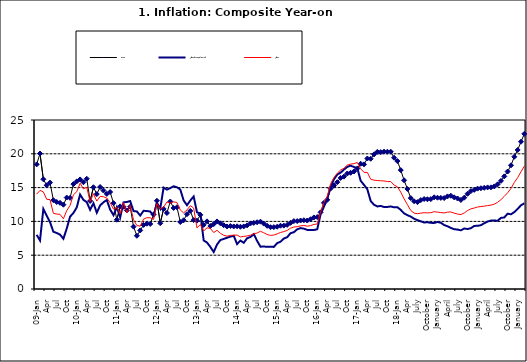
| Category | Food | All Items less Farm Produce | All Items |
|---|---|---|---|
| 09-Jan | 18.436 | 8.013 | 14.034 |
| Feb | 20.041 | 7.178 | 14.584 |
| Mar | 16.233 | 11.842 | 14.366 |
| Apr | 15.342 | 10.85 | 13.268 |
| May | 15.74 | 9.88 | 13.212 |
| June | 13.138 | 8.472 | 11.194 |
| Jul | 12.867 | 8.285 | 11.09 |
| Aug | 12.746 | 8.044 | 11.046 |
| Sep | 12.472 | 7.431 | 10.39 |
| Oct | 13.524 | 8.933 | 11.588 |
| Nov | 13.482 | 10.702 | 12.368 |
| Dec | 15.518 | 11.249 | 13.93 |
| 10-Jan | 15.918 | 12.063 | 14.398 |
| Feb | 16.208 | 13.978 | 15.649 |
| Mar | 15.79 | 13.184 | 14.812 |
| Apr | 16.306 | 12.844 | 15.044 |
| May | 13.023 | 11.711 | 12.915 |
| Jun | 15.053 | 12.686 | 14.099 |
| Jul | 14.043 | 11.287 | 13.002 |
| Aug | 15.09 | 12.366 | 13.702 |
| Sep | 14.57 | 12.83 | 13.65 |
| Oct | 14.065 | 13.168 | 13.45 |
| Nov | 14.351 | 11.746 | 12.766 |
| Dec | 12.701 | 10.917 | 11.815 |
| 11-Jan | 10.255 | 12.118 | 12.08 |
| Feb | 12.221 | 10.569 | 11.1 |
| Mar | 12.169 | 12.815 | 12.779 |
| Apr | 11.629 | 12.882 | 11.291 |
| May | 12.179 | 13.006 | 12.352 |
| Jun | 9.22 | 11.524 | 10.23 |
| Jul | 7.877 | 11.472 | 9.397 |
| Aug | 8.665 | 10.863 | 9.301 |
| Sep | 9.479 | 11.567 | 10.339 |
| Oct | 9.656 | 11.539 | 10.544 |
| Nov | 9.623 | 11.459 | 10.54 |
| Dec | 11.02 | 10.822 | 10.283 |
| 12-Jan | 13.053 | 12.748 | 12.626 |
| 12-Feb | 9.729 | 11.901 | 11.866 |
| 12-Mar | 11.848 | 14.995 | 12.111 |
| Apr | 11.246 | 14.703 | 12.866 |
| May | 12.942 | 14.926 | 12.688 |
| Jun | 11.991 | 15.199 | 12.892 |
| Jul | 12.093 | 15.045 | 12.797 |
| Aug | 9.91 | 14.714 | 11.689 |
| Sep | 10.164 | 13.101 | 11.253 |
| Oct | 11.064 | 12.398 | 11.693 |
| Nov | 11.553 | 13.092 | 12.32 |
| Dec | 10.199 | 13.685 | 11.981 |
| 13-Jan | 10.106 | 11.342 | 9.031 |
| Feb | 10.973 | 11.184 | 9.542 |
| Mar | 9.482 | 7.179 | 8.593 |
| Apr | 10.006 | 6.874 | 9.052 |
| May | 9.321 | 6.227 | 8.964 |
| Jun | 9.606 | 5.472 | 8.353 |
| Jul | 9.994 | 6.58 | 8.682 |
| Aug | 9.723 | 7.245 | 8.231 |
| Sep | 9.437 | 7.41 | 7.952 |
| Oct | 9.249 | 7.579 | 7.807 |
| Nov | 9.313 | 7.75 | 7.931 |
| Dec | 9.253 | 7.872 | 7.957 |
| 14-Jan | 9.271 | 6.648 | 7.977 |
| Feb | 9.207 | 7.166 | 7.707 |
| Mar | 9.254 | 6.836 | 7.783 |
| Apr | 9.414 | 7.508 | 7.851 |
| May | 9.698 | 7.693 | 7.965 |
| Jun | 9.776 | 8.122 | 8.167 |
| Jul | 9.878 | 7.116 | 8.281 |
| Aug | 9.959 | 6.264 | 8.534 |
| Sep | 9.676 | 6.278 | 8.317 |
| Oct | 9.343 | 6.252 | 8.06 |
| Nov | 9.144 | 6.255 | 7.927 |
| Dec | 9.152 | 6.225 | 7.978 |
| 15-Jan | 9.215 | 6.787 | 8.157 |
| Feb | 9.359 | 6.994 | 8.359 |
| Mar | 9.376 | 7.46 | 8.494 |
| Apr | 9.49 | 7.661 | 8.655 |
| May | 9.782 | 8.253 | 9.003 |
| Jun | 10.041 | 8.403 | 9.168 |
| Jul | 10.049 | 8.83 | 9.218 |
| Aug | 10.131 | 9.01 | 9.336 |
| Sep | 10.174 | 8.928 | 9.394 |
| Oct | 10.129 | 8.742 | 9.296 |
| Nov | 10.321 | 8.732 | 9.368 |
| Dec | 10.588 | 8.727 | 9.554 |
| 16-Jan | 10.642 | 8.841 | 9.617 |
| Feb | 11.348 | 11.041 | 11.379 |
| Mar | 12.745 | 12.17 | 12.775 |
| Apr | 13.194 | 13.352 | 13.721 |
| May | 14.861 | 15.054 | 15.577 |
| Jun | 15.302 | 16.224 | 16.48 |
| Jul | 15.799 | 16.929 | 17.127 |
| Aug | 16.427 | 17.208 | 17.609 |
| Sep | 16.622 | 17.666 | 17.852 |
| Oct | 17.09 | 18.067 | 18.33 |
| Nov | 17.191 | 18.241 | 18.476 |
| Dec | 17.388 | 18.052 | 18.547 |
| 17-Jan | 17.818 | 17.867 | 18.719 |
| Feb | 18.528 | 16.011 | 17.78 |
| Mar | 18.436 | 15.404 | 17.256 |
| Apr | 19.303 | 14.75 | 17.244 |
| May | 19.266 | 13.016 | 16.251 |
| Jun | 19.915 | 12.455 | 16.098 |
| Jul | 20.284 | 12.207 | 16.053 |
| Aug | 20.251 | 12.296 | 16.012 |
| Sep | 20.321 | 12.123 | 15.979 |
| Oct | 20.306 | 12.142 | 15.905 |
| Nov | 20.308 | 12.206 | 15.901 |
| Dec | 19.415 | 12.089 | 15.372 |
| 18-Jan | 18.919 | 12.09 | 15.127 |
| Feb | 17.588 | 11.707 | 14.33 |
| Mar | 16.08 | 11.181 | 13.337 |
| Apr | 14.799 | 10.92 | 12.482 |
| May | 13.448 | 10.71 | 11.608 |
| June | 12.977 | 10.387 | 11.231 |
| July | 12.85 | 10.183 | 11.142 |
| August | 13.158 | 10.015 | 11.227 |
| September | 13.309 | 9.838 | 11.284 |
| October | 13.277 | 9.882 | 11.259 |
| November | 13.301 | 9.787 | 11.281 |
| December | 13.559 | 9.771 | 11.442 |
| January | 13.505 | 9.91 | 11.374 |
| February | 13.473 | 9.8 | 11.306 |
| March | 13.451 | 9.461 | 11.251 |
| April | 13.701 | 9.28 | 11.372 |
| May | 13.794 | 9.033 | 11.396 |
| June | 13.558 | 8.841 | 11.217 |
| July | 13.392 | 8.798 | 11.084 |
| August | 13.17 | 8.678 | 11.016 |
| September | 13.507 | 8.945 | 11.244 |
| October | 14.088 | 8.876 | 11.607 |
| November | 14.482 | 8.993 | 11.854 |
| December | 14.667 | 9.331 | 11.982 |
| January | 14.849 | 9.349 | 12.132 |
| February | 14.904 | 9.434 | 12.199 |
| March | 14.977 | 9.732 | 12.257 |
| April | 15.026 | 9.979 | 12.341 |
| May | 15.036 | 10.12 | 12.404 |
| June | 15.175 | 10.128 | 12.559 |
| July | 15.482 | 10.102 | 12.821 |
| August | 15.996 | 10.521 | 13.22 |
| September | 16.66 | 10.581 | 13.707 |
| October | 17.378 | 11.137 | 14.233 |
| November | 18.298 | 11.05 | 14.887 |
| December | 19.562 | 11.374 | 15.753 |
| January | 20.567 | 11.854 | 16.466 |
| February | 21.786 | 12.382 | 17.335 |
| March | 22.948 | 12.673 | 18.171 |